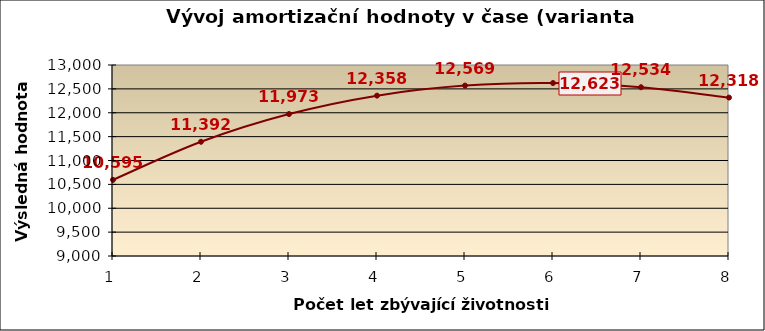
| Category | Series 0 |
|---|---|
| 1.0 | 10594.56 |
| 2.0 | 11392.244 |
| 3.0 | 11972.685 |
| 4.0 | 12358.359 |
| 5.0 | 12569.162 |
| 6.0 | 12622.676 |
| 7.0 | 12534.414 |
| 8.0 | 12318.041 |